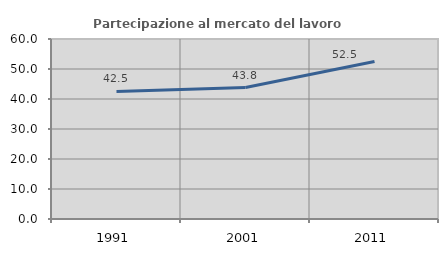
| Category | Partecipazione al mercato del lavoro  femminile |
|---|---|
| 1991.0 | 42.505 |
| 2001.0 | 43.812 |
| 2011.0 | 52.518 |